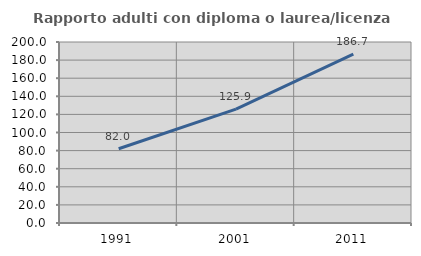
| Category | Rapporto adulti con diploma o laurea/licenza media  |
|---|---|
| 1991.0 | 82.008 |
| 2001.0 | 125.909 |
| 2011.0 | 186.709 |